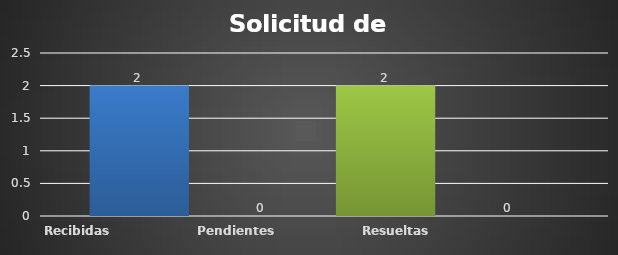
| Category | Recibidas  | Pendientes  | Resueltas | Rechazadas  |
|---|---|---|---|---|
| Recibidas  | 2 | 0 | 2 | 0 |